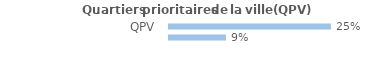
| Category | Series 0 |
|---|---|
| QPV | 0.252 |
| Hors QPV | 0.088 |